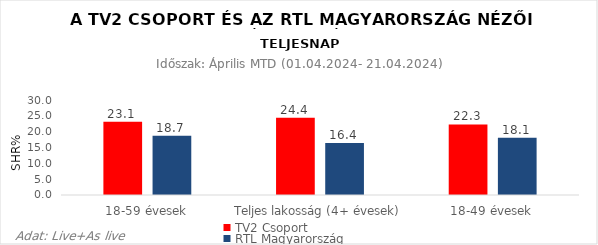
| Category | TV2 Csoport | RTL Magyarország |
|---|---|---|
| 18-59 évesek | 23.1 | 18.7 |
| Teljes lakosság (4+ évesek) | 24.4 | 16.4 |
| 18-49 évesek | 22.3 | 18.1 |